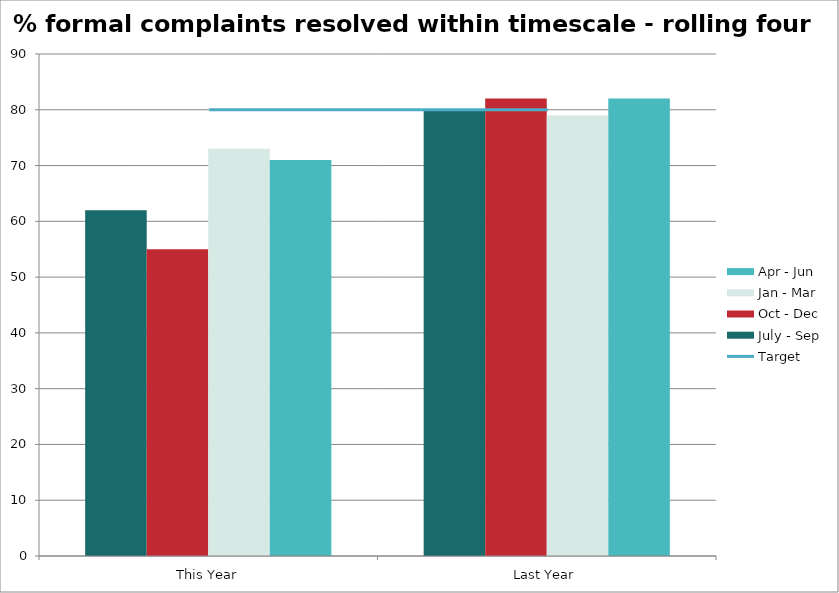
| Category | July - Sep | Oct - Dec | Jan - Mar | Apr - Jun |
|---|---|---|---|---|
| This Year | 62 | 55 | 73 | 71 |
| Last Year | 80 | 82 | 79 | 82 |